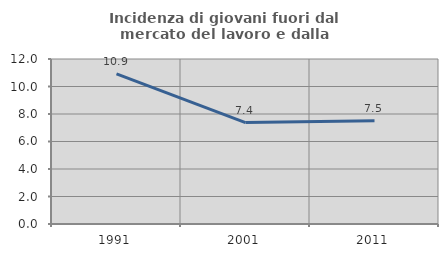
| Category | Incidenza di giovani fuori dal mercato del lavoro e dalla formazione  |
|---|---|
| 1991.0 | 10.922 |
| 2001.0 | 7.373 |
| 2011.0 | 7.505 |